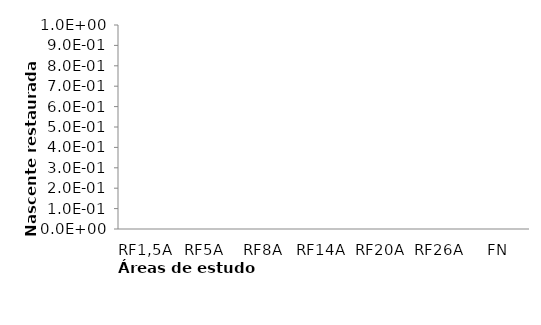
| Category | Series 0 |
|---|---|
| RF1,5A | 0 |
| RF5A | 0 |
| RF8A | 0 |
| RF14A | 0 |
| RF20A | 0 |
| RF26A | 0 |
| FN | 0 |